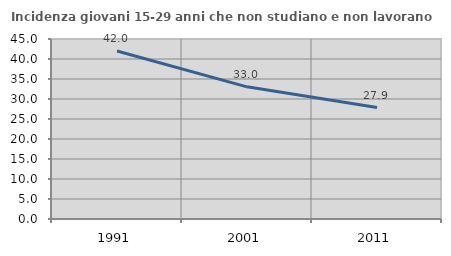
| Category | Incidenza giovani 15-29 anni che non studiano e non lavorano  |
|---|---|
| 1991.0 | 41.991 |
| 2001.0 | 33.039 |
| 2011.0 | 27.871 |